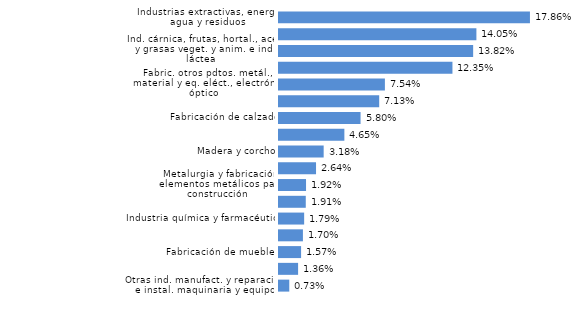
| Category | La Rioja |
|---|---|
| Otras ind. manufact. y reparación e instal. maquinaria y equipo | 0.007 |
| Forja y talleres | 0.014 |
| Fabricación de muebles | 0.016 |
| Ind. textil, confección, cuero, marroquinería y viaje | 0.017 |
| Industria química y farmacéutica | 0.018 |
| Papel, artes gráficas y reproducción soportes grabados | 0.019 |
| Metalurgia y fabricación elementos metálicos para construcción | 0.019 |
| Productos minerales no metálicos diversos | 0.026 |
| Madera y corcho | 0.032 |
| Fabricación de maquinaria, equipo y material de transporte | 0.047 |
| Fabricación de calzado | 0.058 |
| Caucho y materias plásticas | 0.071 |
| Fabric. otros pdtos. metál., material y eq. eléct., electrón. y óptico | 0.075 |
| Otras ind. alimenticias, bebidas (exto. elaborac. vinos) y tabaco | 0.123 |
| Ind. cárnica, frutas, hortal., aceit. y grasas veget. y anim. e ind. láctea | 0.138 |
| Elaboración de vinos | 0.14 |
| Industrias extractivas, energía, agua y residuos | 0.179 |